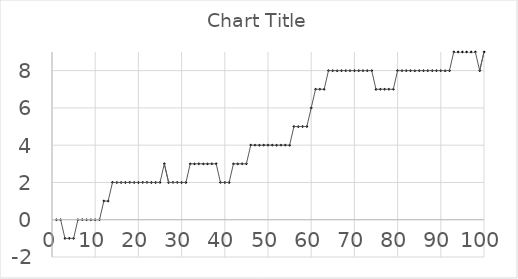
| Category | Series 0 |
|---|---|
| 0 | 0 |
| 1 | 0 |
| 2 | -1 |
| 3 | -1 |
| 4 | -1 |
| 5 | 0 |
| 6 | 0 |
| 7 | 0 |
| 8 | 0 |
| 9 | 0 |
| 10 | 0 |
| 11 | 1 |
| 12 | 1 |
| 13 | 2 |
| 14 | 2 |
| 15 | 2 |
| 16 | 2 |
| 17 | 2 |
| 18 | 2 |
| 19 | 2 |
| 20 | 2 |
| 21 | 2 |
| 22 | 2 |
| 23 | 2 |
| 24 | 2 |
| 25 | 3 |
| 26 | 2 |
| 27 | 2 |
| 28 | 2 |
| 29 | 2 |
| 30 | 2 |
| 31 | 3 |
| 32 | 3 |
| 33 | 3 |
| 34 | 3 |
| 35 | 3 |
| 36 | 3 |
| 37 | 3 |
| 38 | 2 |
| 39 | 2 |
| 40 | 2 |
| 41 | 3 |
| 42 | 3 |
| 43 | 3 |
| 44 | 3 |
| 45 | 4 |
| 46 | 4 |
| 47 | 4 |
| 48 | 4 |
| 49 | 4 |
| 50 | 4 |
| 51 | 4 |
| 52 | 4 |
| 53 | 4 |
| 54 | 4 |
| 55 | 5 |
| 56 | 5 |
| 57 | 5 |
| 58 | 5 |
| 59 | 6 |
| 60 | 7 |
| 61 | 7 |
| 62 | 7 |
| 63 | 8 |
| 64 | 8 |
| 65 | 8 |
| 66 | 8 |
| 67 | 8 |
| 68 | 8 |
| 69 | 8 |
| 70 | 8 |
| 71 | 8 |
| 72 | 8 |
| 73 | 8 |
| 74 | 7 |
| 75 | 7 |
| 76 | 7 |
| 77 | 7 |
| 78 | 7 |
| 79 | 8 |
| 80 | 8 |
| 81 | 8 |
| 82 | 8 |
| 83 | 8 |
| 84 | 8 |
| 85 | 8 |
| 86 | 8 |
| 87 | 8 |
| 88 | 8 |
| 89 | 8 |
| 90 | 8 |
| 91 | 8 |
| 92 | 9 |
| 93 | 9 |
| 94 | 9 |
| 95 | 9 |
| 96 | 9 |
| 97 | 9 |
| 98 | 8 |
| 99 | 9 |